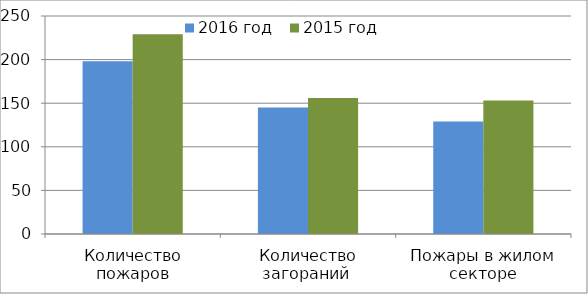
| Category | 2016 год | 2015 год |
|---|---|---|
| Количество пожаров | 198 | 229 |
| Количество загораний  | 145 | 156 |
| Пожары в жилом секторе | 129 | 153 |